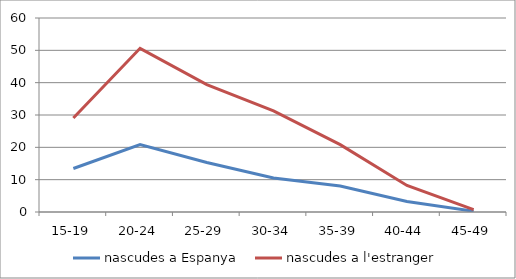
| Category | nascudes a Espanya  | nascudes a l'estranger |
|---|---|---|
| 15-19 | 13.453 | 29.089 |
| 20-24 | 20.875 | 50.625 |
| 25-29 | 15.295 | 39.377 |
| 30-34 | 10.537 | 31.275 |
| 35-39 | 8.025 | 20.834 |
| 40-44 | 3.268 | 8.197 |
| 45-49 | 0.244 | 0.734 |